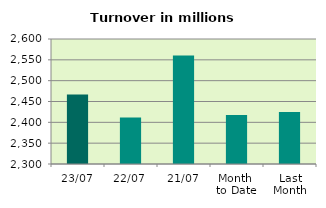
| Category | Series 0 |
|---|---|
| 23/07 | 2466.978 |
| 22/07 | 2411.673 |
| 21/07 | 2560.488 |
| Month 
to Date | 2417.528 |
| Last
Month | 2424.747 |